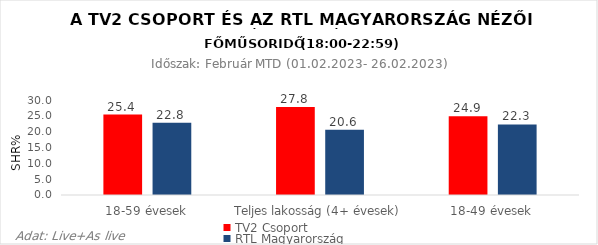
| Category | TV2 Csoport | RTL Magyarország |
|---|---|---|
| 18-59 évesek | 25.4 | 22.8 |
| Teljes lakosság (4+ évesek) | 27.8 | 20.6 |
| 18-49 évesek | 24.9 | 22.3 |